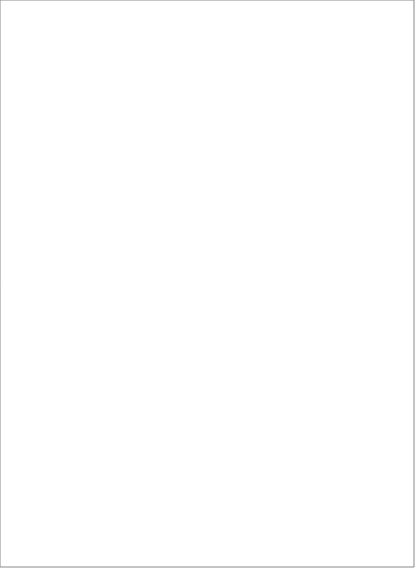
| Category | Series 0 |
|---|---|
| Maksas par veselības aprūpes pakalpojumiem ko sniedz ārstniecības iestādes | 0 |
| Sociālās drošības tīkla pasākumi | 0 |
| Neatliekamā medicīnas palīdzība | -852001.458 |
| Sabiedrības veselības dienestu pakalpojumi | -241799.662 |
| Medikamentu un materiālu iegāde, KF militāro pensionāru aprūpe, ē-veselība un interešu izglītība | -493707.58 |
| Veselības aprūpe amatpersonām ar speciālajām dienesta pakāpēm | -77664.397 |
| Infekcijas slimību specifiskā diagnostika, ārstēšana un profilakse | -1680754.2 |
| Kompensējamie un retie medikamenti | -7466218.661 |
| Sporta medicīnas nodrošināšana | -144992.4 |